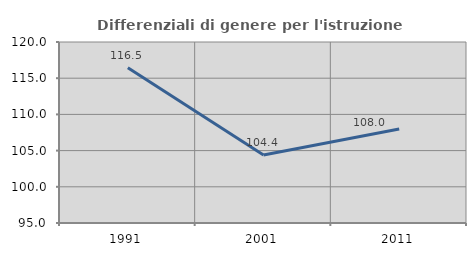
| Category | Differenziali di genere per l'istruzione superiore |
|---|---|
| 1991.0 | 116.454 |
| 2001.0 | 104.403 |
| 2011.0 | 107.973 |